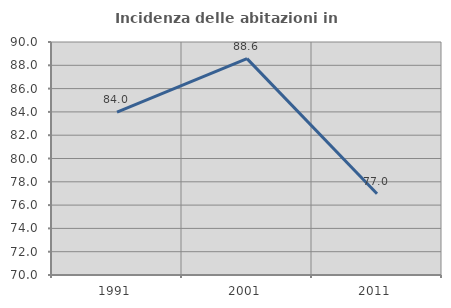
| Category | Incidenza delle abitazioni in proprietà  |
|---|---|
| 1991.0 | 83.987 |
| 2001.0 | 88.571 |
| 2011.0 | 76.978 |